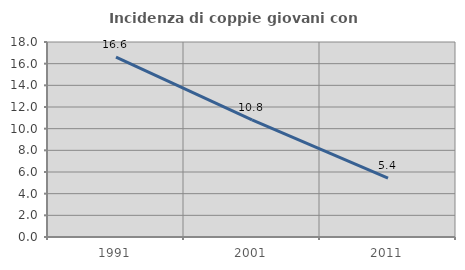
| Category | Incidenza di coppie giovani con figli |
|---|---|
| 1991.0 | 16.594 |
| 2001.0 | 10.816 |
| 2011.0 | 5.433 |